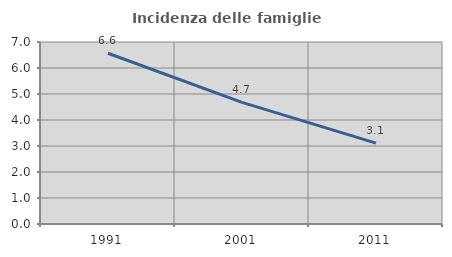
| Category | Incidenza delle famiglie numerose |
|---|---|
| 1991.0 | 6.567 |
| 2001.0 | 4.678 |
| 2011.0 | 3.109 |